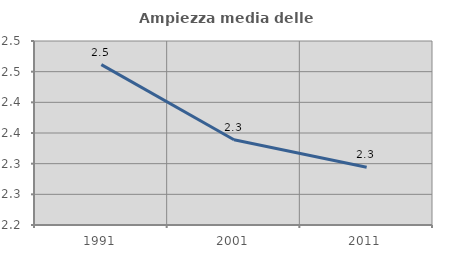
| Category | Ampiezza media delle famiglie |
|---|---|
| 1991.0 | 2.462 |
| 2001.0 | 2.339 |
| 2011.0 | 2.294 |